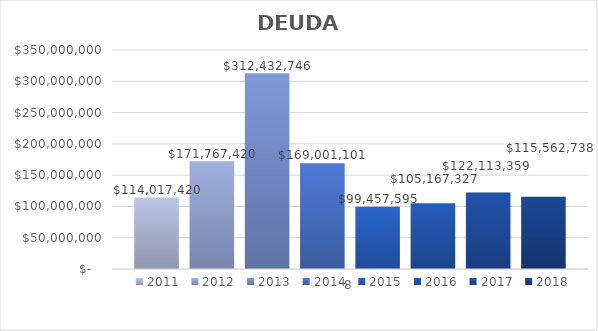
| Category | 2011 | 2012 | 2013 | 2014 | 2015 | 2016 | 2017 | 2018 |
|---|---|---|---|---|---|---|---|---|
| 0 | 114017420 | 171767420 | 312432746 | 169001100.65 | 99457595 | 105167327.47 | 122113358.96 | 115562738.17 |